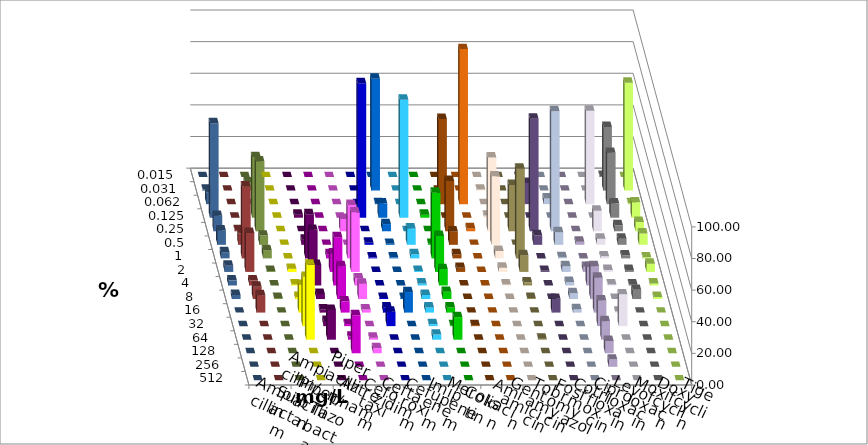
| Category | Ampicillin | Ampicillin/ Sulbactam | Piperacillin | Piperacillin/ Tazobactam | Aztreonam | Cefotaxim | Ceftazidim | Cefuroxim | Imipenem | Meropenem | Colistin | Amikacin | Gentamicin | Tobramycin | Fosfomycin | Cotrimoxazol | Ciprofloxacin | Levofloxacin | Moxifloxacin | Doxycyclin | Tigecyclin |
|---|---|---|---|---|---|---|---|---|---|---|---|---|---|---|---|---|---|---|---|---|---|
| 0.015 | 0 | 0 | 0 | 0 | 0 | 0 | 0 | 0 | 0 | 0 | 0 | 0 | 0 | 0 | 0 | 0 | 0.649 | 0 | 0 | 0 | 0 |
| 0.031 | 0 | 0 | 0 | 0 | 0 | 70.779 | 0 | 0 | 0 | 0 | 0.667 | 0 | 0 | 0 | 0 | 0 | 40.26 | 68.182 | 0.649 | 0 | 5.195 |
| 0.062 | 0 | 0 | 0 | 0 | 0 | 0.649 | 0 | 0 | 53.896 | 98.052 | 0 | 0 | 13.423 | 3.65 | 0 | 59.091 | 32.468 | 0.649 | 7.143 | 0 | 0 |
| 0.125 | 0 | 1.948 | 0 | 0 | 85.065 | 9.091 | 74.675 | 1.948 | 0 | 0 | 1.333 | 0 | 0 | 0 | 0 | 0 | 9.091 | 9.74 | 59.74 | 0 | 38.312 |
| 0.25 | 0 | 0 | 0 | 7.792 | 0 | 4.545 | 0 | 0 | 31.818 | 1.948 | 46.667 | 29.333 | 71.141 | 75.912 | 0 | 12.987 | 3.896 | 5.844 | 9.74 | 0.649 | 44.156 |
| 0.5 | 0 | 3.247 | 0 | 0 | 1.299 | 0.649 | 10.39 | 0.649 | 8.442 | 0 | 43.333 | 0 | 6.04 | 8.029 | 1.948 | 3.896 | 3.896 | 7.143 | 9.091 | 7.143 | 5.844 |
| 1.0 | 0 | 27.922 | 2.597 | 33.766 | 0.649 | 0.649 | 2.597 | 41.558 | 2.597 | 0 | 4.667 | 56.667 | 0 | 0.73 | 0 | 1.299 | 1.948 | 0.649 | 3.896 | 45.455 | 5.195 |
| 2.0 | 1.948 | 26.623 | 11.688 | 37.662 | 0 | 0 | 0.649 | 22.727 | 2.597 | 0 | 2.667 | 10.667 | 0.671 | 3.65 | 3.247 | 1.299 | 1.299 | 5.195 | 3.896 | 24.675 | 0.649 |
| 4.0 | 0.649 | 12.987 | 30.519 | 4.545 | 0 | 0 | 1.299 | 10.39 | 0 | 0 | 0.667 | 2 | 0 | 2.19 | 11.688 | 0.649 | 0.649 | 1.299 | 3.247 | 3.247 | 0 |
| 8.0 | 1.299 | 3.247 | 20.779 | 9.74 | 0.649 | 0.649 | 2.597 | 4.545 | 0 | 0 | 0 | 0.667 | 0 | 3.65 | 20.779 | 0 | 5.844 | 1.299 | 2.597 | 7.792 | 0.649 |
| 16.0 | 17.532 | 1.948 | 7.143 | 1.948 | 3.247 | 12.987 | 3.247 | 3.247 | 0 | 0 | 0 | 0 | 8.725 | 2.19 | 22.078 | 0.649 | 0 | 0 | 0 | 11.039 | 0 |
| 32.0 | 31.169 | 3.247 | 1.299 | 0 | 9.091 | 0 | 1.299 | 0.649 | 0.649 | 0 | 0 | 0 | 0 | 0 | 16.234 | 20.13 | 0 | 0 | 0 | 0 | 0 |
| 64.0 | 47.403 | 18.831 | 1.948 | 1.299 | 0 | 0 | 3.247 | 14.286 | 0 | 0 | 0 | 0.667 | 0 | 0 | 11.688 | 0 | 0 | 0 | 0 | 0 | 0 |
| 128.0 | 0 | 0 | 24.026 | 3.247 | 0 | 0 | 0 | 0 | 0 | 0 | 0 | 0 | 0 | 0 | 7.792 | 0 | 0 | 0 | 0 | 0 | 0 |
| 256.0 | 0 | 0 | 0 | 0 | 0 | 0 | 0 | 0 | 0 | 0 | 0 | 0 | 0 | 0 | 4.545 | 0 | 0 | 0 | 0 | 0 | 0 |
| 512.0 | 0 | 0 | 0 | 0 | 0 | 0 | 0 | 0 | 0 | 0 | 0 | 0 | 0 | 0 | 0 | 0 | 0 | 0 | 0 | 0 | 0 |